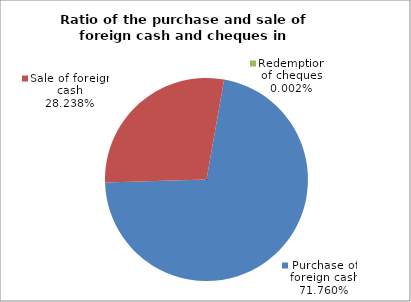
| Category | Purchase of foreign cash |
|---|---|
| 0 | 0.718 |
| 1 | 0.282 |
| 2 | 0 |